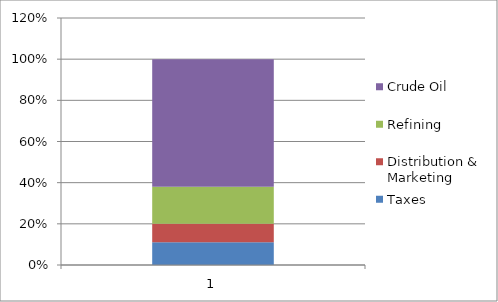
| Category | Taxes | Distribution & Marketing | Refining | Crude Oil |
|---|---|---|---|---|
| 0 | 0.11 | 0.09 | 0.18 | 0.62 |